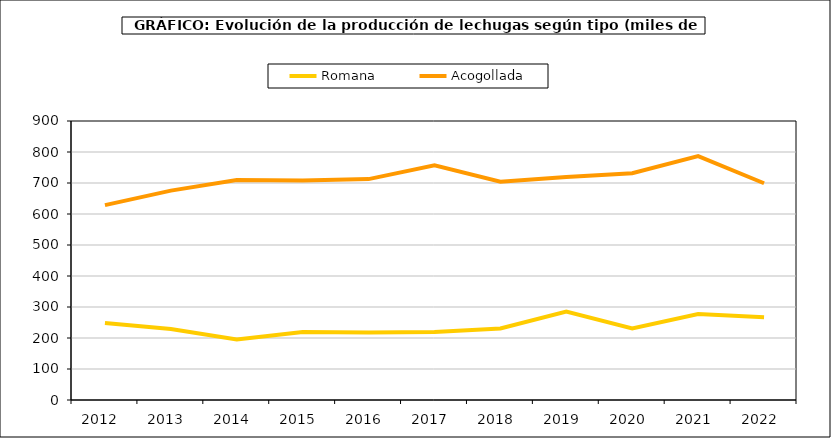
| Category | Romana | Acogollada |
|---|---|---|
| 2012.0 | 248.374 | 628.552 |
| 2013.0 | 228.928 | 675.355 |
| 2014.0 | 195.068 | 709.734 |
| 2015.0 | 219.245 | 708.133 |
| 2016.0 | 217.427 | 712.517 |
| 2017.0 | 219.317 | 756.795 |
| 2018.0 | 230.508 | 704.162 |
| 2019.0 | 285.298 | 719.379 |
| 2020.0 | 230.586 | 731.352 |
| 2021.0 | 277.033 | 786.742 |
| 2022.0 | 267.285 | 699.258 |